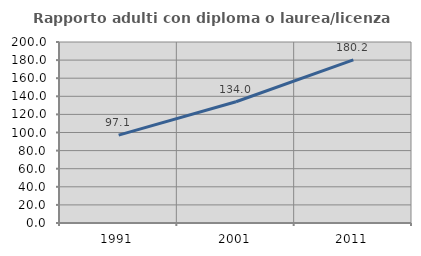
| Category | Rapporto adulti con diploma o laurea/licenza media  |
|---|---|
| 1991.0 | 97.067 |
| 2001.0 | 133.977 |
| 2011.0 | 180.186 |